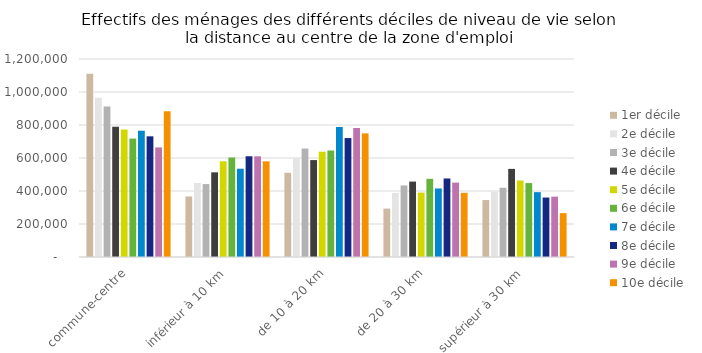
| Category | 1er décile | 2e décile | 3e décile | 4e décile | 5e décile | 6e décile | 7e décile | 8e décile | 9e décile | 10e décile |
|---|---|---|---|---|---|---|---|---|---|---|
| commune-centre | 1111016 | 965589 | 911739 | 789201 | 772414 | 717892 | 765343 | 731369 | 664154 | 883611 |
| inférieur à 10 km | 366850 | 448507 | 441977 | 513119 | 580023 | 602966 | 535106 | 610497 | 610200 | 579854 |
| de 10 à 20 km | 510273 | 597432 | 657097 | 587445 | 638082 | 645561 | 788269 | 720996 | 781995 | 749232 |
| de 20 à 30 km | 293272 | 388184 | 433570 | 457044 | 390567 | 473879 | 415415 | 475869 | 450950 | 388941 |
| supérieur à 30 km | 345226 | 395719 | 419433 | 534021 | 463620 | 448026 | 393024 | 360445 | 365717 | 265833 |